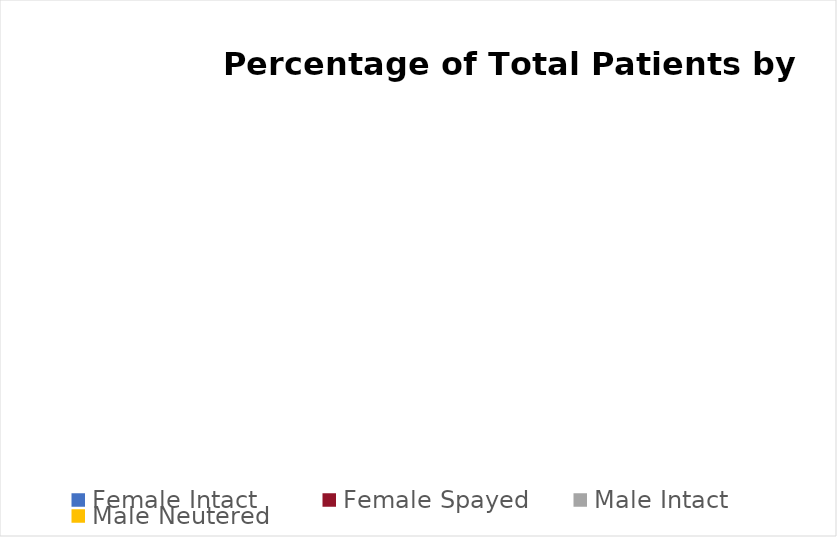
| Category | Series 0 |
|---|---|
| Female Intact | 0 |
| Female Spayed | 0 |
| Male Intact | 0 |
| Male Neutered | 0 |